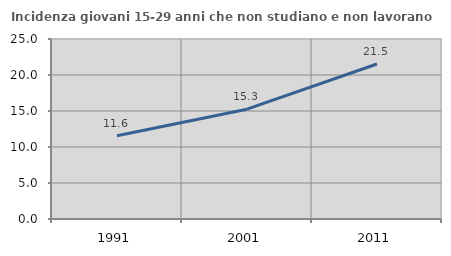
| Category | Incidenza giovani 15-29 anni che non studiano e non lavorano  |
|---|---|
| 1991.0 | 11.568 |
| 2001.0 | 15.254 |
| 2011.0 | 21.528 |